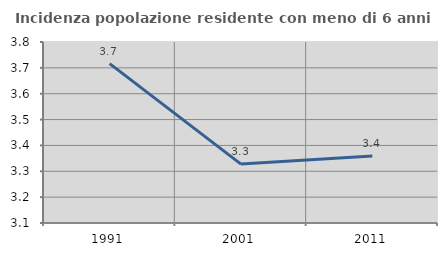
| Category | Incidenza popolazione residente con meno di 6 anni |
|---|---|
| 1991.0 | 3.716 |
| 2001.0 | 3.328 |
| 2011.0 | 3.359 |